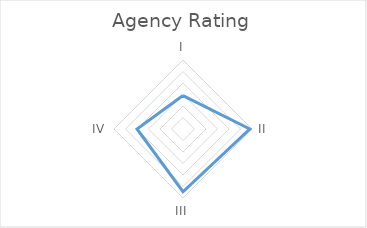
| Category | Series 0 |
|---|---|
| I | 1.455 |
| II | 2.9 |
| III | 2.727 |
| IV | 2 |